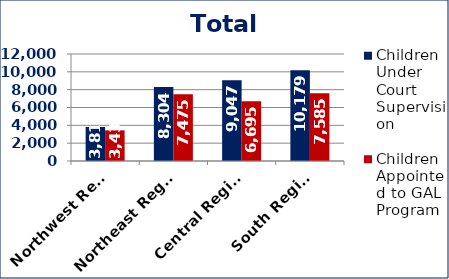
| Category | Children Under Court Supervision  | Children Appointed to GAL Program  |
|---|---|---|
| Northwest Region | 3816 | 3437 |
| Northeast Region | 8304 | 7475 |
| Central Region | 9047 | 6695 |
| South Region | 10179 | 7585 |